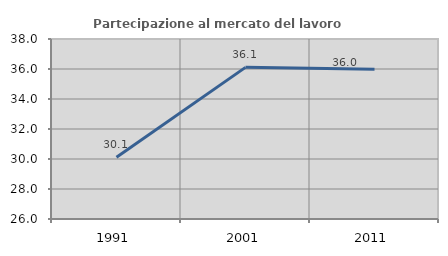
| Category | Partecipazione al mercato del lavoro  femminile |
|---|---|
| 1991.0 | 30.122 |
| 2001.0 | 36.109 |
| 2011.0 | 35.991 |